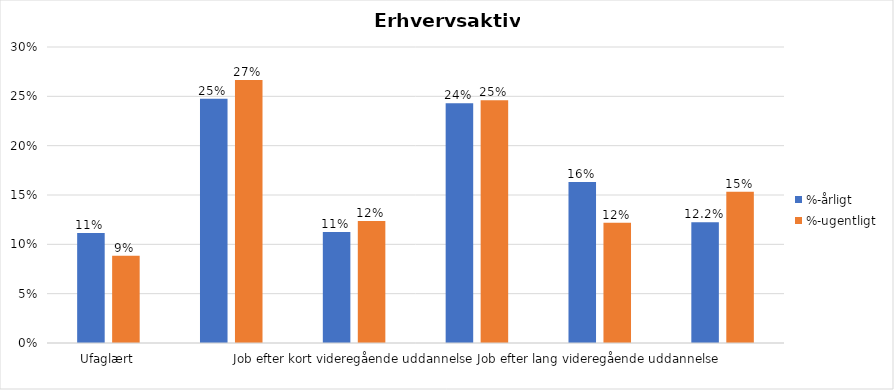
| Category | %-årligt | %-ugentligt |
|---|---|---|
| Ufaglært | 0.111 | 0.088 |
| Erhvervsfagligt job | 0.248 | 0.266 |
| Job efter kort videregående uddannelse | 0.112 | 0.124 |
| Job efter mellemlang videregående uddannelse | 0.243 | 0.246 |
| Job efter lang videregående uddannelse | 0.163 | 0.122 |
| Selvstændig | 0.122 | 0.153 |